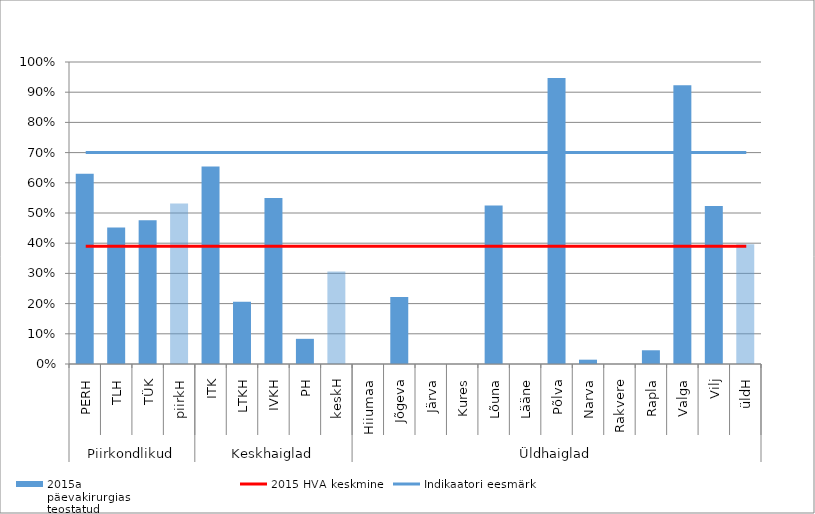
| Category | 2015a
päevakirurgias
teostatud
plaanilised kubemesonga op % |
|---|---|
| 0 | 0.63 |
| 1 | 0.452 |
| 2 | 0.476 |
| 3 | 0.532 |
| 4 | 0.654 |
| 5 | 0.206 |
| 6 | 0.55 |
| 7 | 0.083 |
| 8 | 0.306 |
| 9 | 0 |
| 10 | 0.222 |
| 11 | 0 |
| 12 | 0 |
| 13 | 0.525 |
| 14 | 0 |
| 15 | 0.947 |
| 16 | 0.014 |
| 17 | 0 |
| 18 | 0.045 |
| 19 | 0.923 |
| 20 | 0.523 |
| 21 | 0.397 |